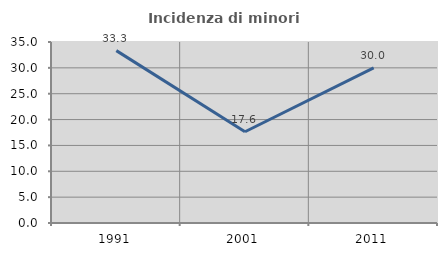
| Category | Incidenza di minori stranieri |
|---|---|
| 1991.0 | 33.333 |
| 2001.0 | 17.647 |
| 2011.0 | 30 |